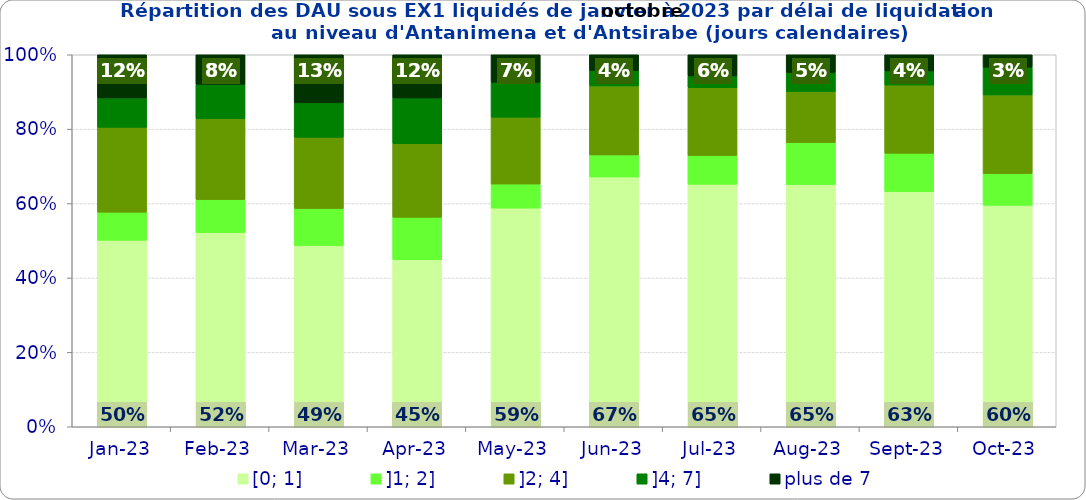
| Category | [0; 1] | ]1; 2] | ]2; 4] | ]4; 7] | plus de 7 |
|---|---|---|---|---|---|
| 2023-01-01 | 0.501 | 0.076 | 0.228 | 0.079 | 0.116 |
| 2023-02-01 | 0.522 | 0.089 | 0.217 | 0.093 | 0.08 |
| 2023-03-01 | 0.487 | 0.1 | 0.191 | 0.092 | 0.129 |
| 2023-04-01 | 0.449 | 0.114 | 0.198 | 0.123 | 0.116 |
| 2023-05-01 | 0.588 | 0.065 | 0.18 | 0.094 | 0.074 |
| 2023-06-01 | 0.672 | 0.059 | 0.185 | 0.041 | 0.043 |
| 2023-07-01 | 0.652 | 0.077 | 0.182 | 0.032 | 0.057 |
| 2023-08-01 | 0.651 | 0.113 | 0.137 | 0.051 | 0.048 |
| 2023-09-01 | 0.632 | 0.103 | 0.183 | 0.038 | 0.044 |
| 2023-10-01 | 0.595 | 0.086 | 0.211 | 0.075 | 0.033 |